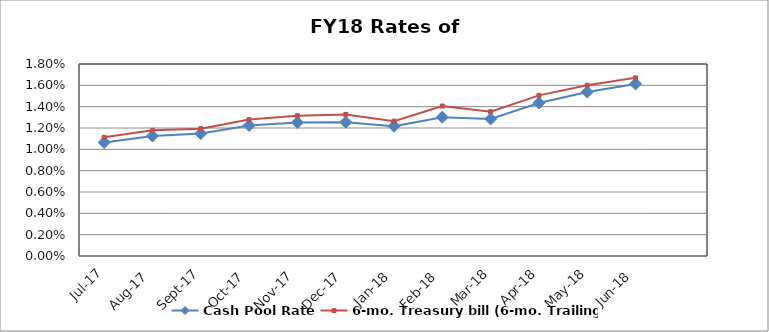
| Category | Cash Pool Rate | 6-mo. Treasury bill (6-mo. Trailing) |
|---|---|---|
| 2017-07-01 | 0.011 | 0.011 |
| 2017-08-01 | 0.011 | 0.012 |
| 2017-09-01 | 0.011 | 0.012 |
| 2017-10-01 | 0.012 | 0.013 |
| 2017-11-01 | 0.013 | 0.013 |
| 2017-12-01 | 0.013 | 0.013 |
| 2018-01-01 | 0.012 | 0.013 |
| 2018-02-01 | 0.013 | 0.014 |
| 2018-03-01 | 0.013 | 0.014 |
| 2018-04-01 | 0.014 | 0.015 |
| 2018-05-01 | 0.015 | 0.016 |
| 2018-06-01 | 0.016 | 0.017 |